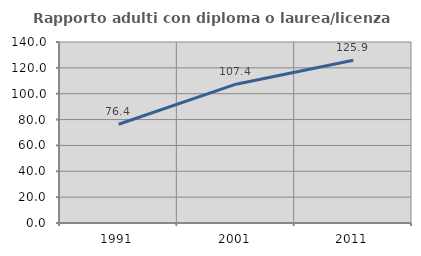
| Category | Rapporto adulti con diploma o laurea/licenza media  |
|---|---|
| 1991.0 | 76.415 |
| 2001.0 | 107.364 |
| 2011.0 | 125.89 |